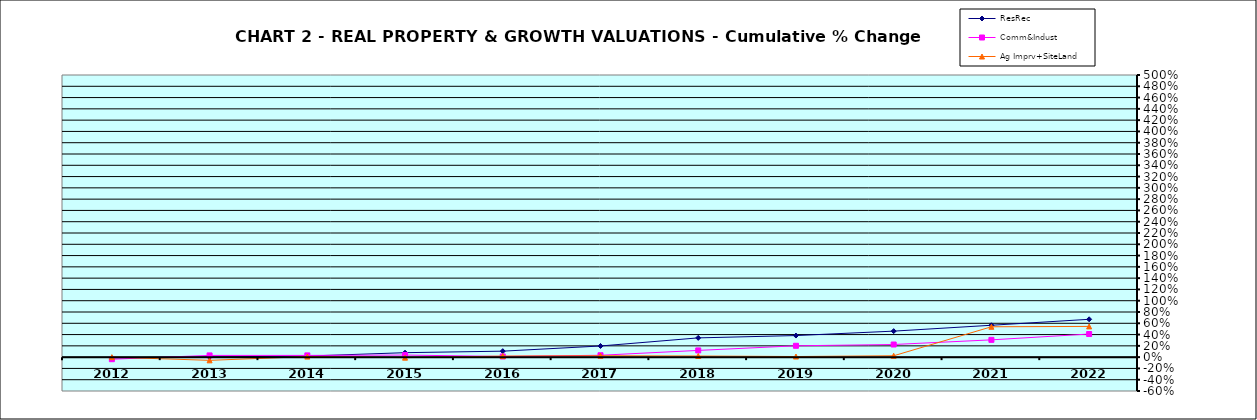
| Category | ResRec | Comm&Indust | Ag Imprv+SiteLand |
|---|---|---|---|
| 2012.0 | -0.013 | -0.036 | 0 |
| 2013.0 | 0.005 | 0.031 | -0.057 |
| 2014.0 | 0.019 | 0.031 | 0.01 |
| 2015.0 | 0.079 | 0.037 | -0.009 |
| 2016.0 | 0.106 | 0.012 | 0.019 |
| 2017.0 | 0.198 | 0.033 | 0.025 |
| 2018.0 | 0.341 | 0.119 | 0.02 |
| 2019.0 | 0.383 | 0.201 | 0.011 |
| 2020.0 | 0.461 | 0.224 | 0.024 |
| 2021.0 | 0.565 | 0.306 | 0.538 |
| 2022.0 | 0.67 | 0.41 | 0.545 |